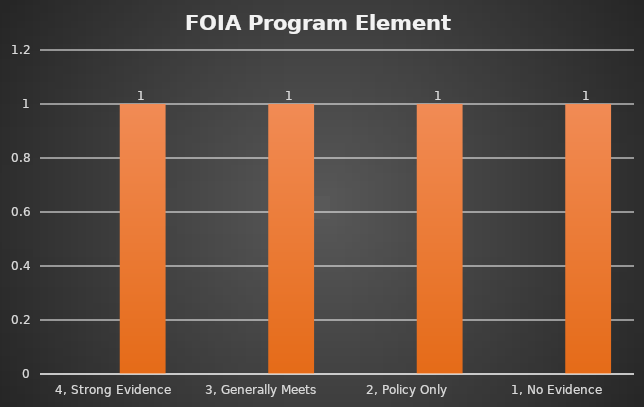
| Category | Series 0 | Total |
|---|---|---|
| 4, Strong Evidence |  | 1 |
| 3, Generally Meets |  | 1 |
| 2, Policy Only  |  | 1 |
| 1, No Evidence  |  | 1 |